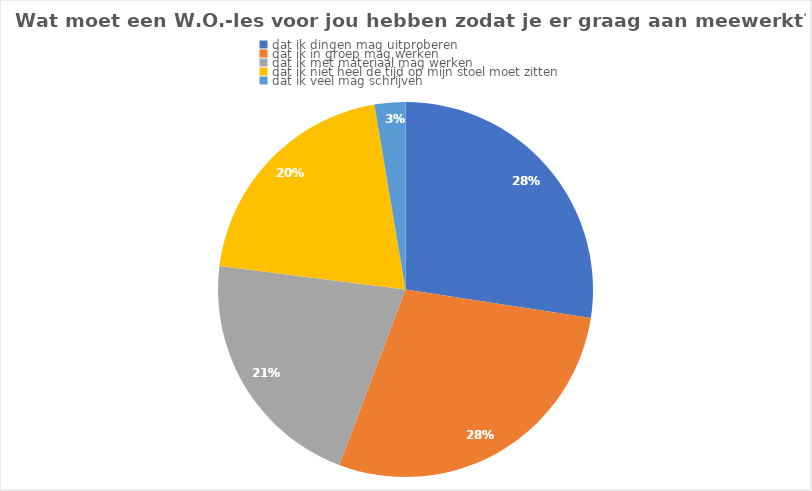
| Category | Series 0 |
|---|---|
| dat ik dingen mag uitproberen | 31 |
| dat ik in groep mag werken | 32 |
| dat ik met materiaal mag werken | 24 |
| dat ik niet heel de tijd op mijn stoel moet zitten | 23 |
| dat ik veel mag schrijven | 3 |